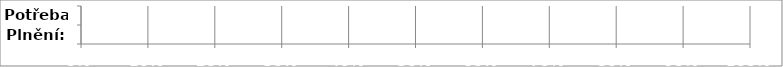
| Category | Series 0 |
|---|---|
| Plnění: | 0 |
| Potřeba: | 0 |